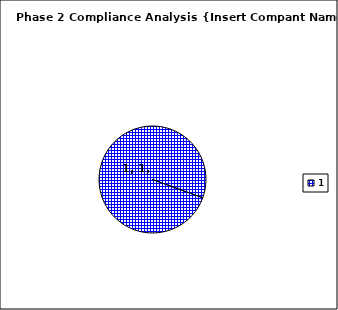
| Category | Series 0 |
|---|---|
| 1.0 | 1 |